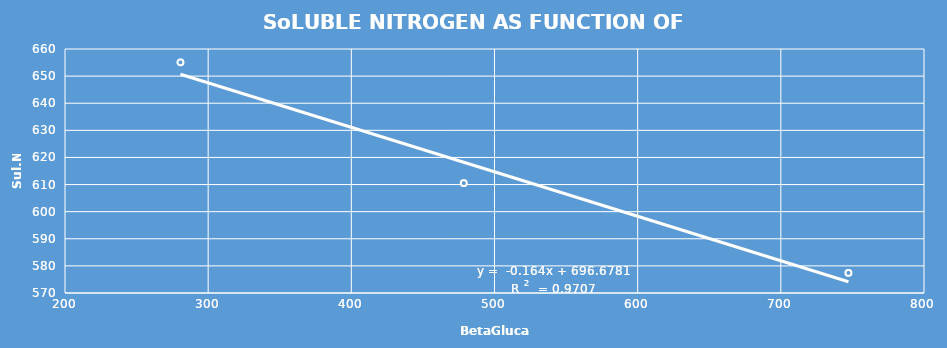
| Category | Series 0 |
|---|---|
| 280.625 | 655.083 |
| 478.5416666666667 | 610.542 |
| 747.2083333333334 | 577.417 |